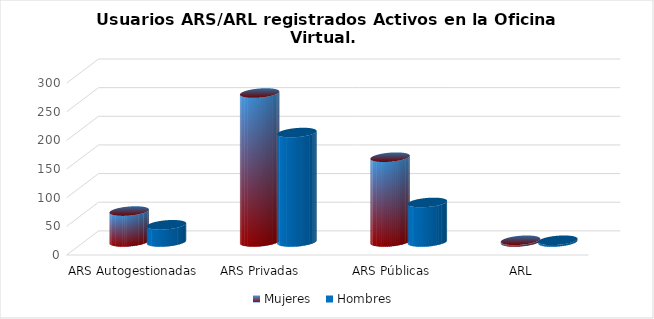
| Category | Mujeres | Hombres |
|---|---|---|
| ARS Autogestionadas | 54 | 30 |
| ARS Privadas | 260 | 191 |
| ARS Públicas | 148 | 69 |
| ARL | 3 | 3 |